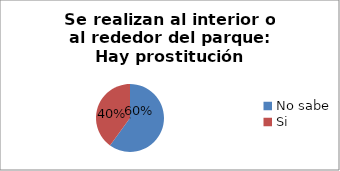
| Category | Series 0 |
|---|---|
| No sabe | 0.6 |
| Si | 0.4 |